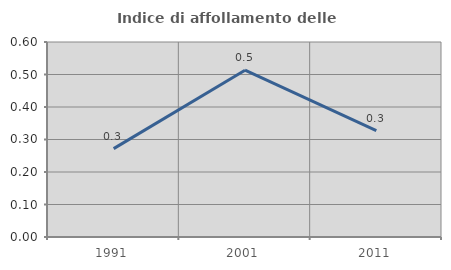
| Category | Indice di affollamento delle abitazioni  |
|---|---|
| 1991.0 | 0.272 |
| 2001.0 | 0.513 |
| 2011.0 | 0.327 |